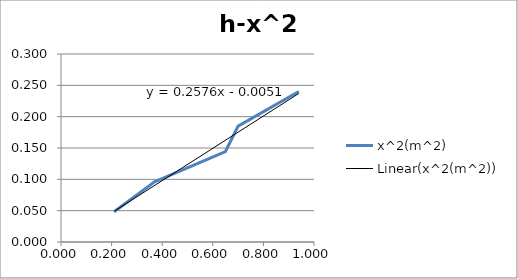
| Category | x^2(m^2) |
|---|---|
| 0.21 | 0.048 |
| 0.37 | 0.096 |
| 0.65 | 0.144 |
| 0.7 | 0.185 |
| 0.94 | 0.24 |